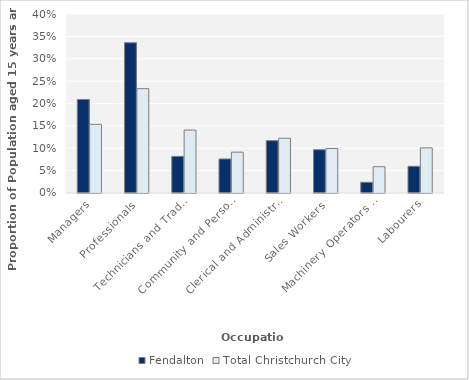
| Category | Fendalton | Total Christchurch City |
|---|---|---|
| Managers | 0.209 | 0.153 |
| Professionals | 0.336 | 0.233 |
| Technicians and Trades Workers | 0.082 | 0.141 |
| Community and Personal Service Workers | 0.076 | 0.091 |
| Clerical and Administrative Workers | 0.117 | 0.122 |
| Sales Workers | 0.097 | 0.099 |
| Machinery Operators and Drivers | 0.024 | 0.059 |
| Labourers | 0.06 | 0.101 |